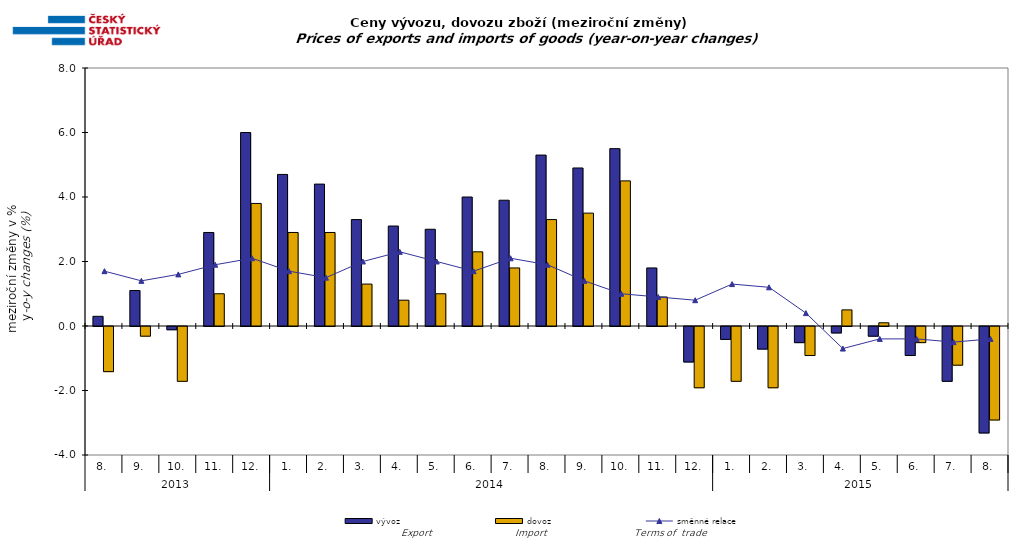
| Category | vývoz | dovoz |
|---|---|---|
| 0 | 0.3 | -1.4 |
| 1 | 1.1 | -0.3 |
| 2 | -0.1 | -1.7 |
| 3 | 2.9 | 1 |
| 4 | 6 | 3.8 |
| 5 | 4.7 | 2.9 |
| 6 | 4.4 | 2.9 |
| 7 | 3.3 | 1.3 |
| 8 | 3.1 | 0.8 |
| 9 | 3 | 1 |
| 10 | 4 | 2.3 |
| 11 | 3.9 | 1.8 |
| 12 | 5.3 | 3.3 |
| 13 | 4.9 | 3.5 |
| 14 | 5.5 | 4.5 |
| 15 | 1.8 | 0.9 |
| 16 | -1.1 | -1.9 |
| 17 | -0.4 | -1.7 |
| 18 | -0.7 | -1.9 |
| 19 | -0.5 | -0.9 |
| 20 | -0.2 | 0.5 |
| 21 | -0.3 | 0.1 |
| 22 | -0.9 | -0.5 |
| 23 | -1.7 | -1.2 |
| 24 | -3.3 | -2.9 |